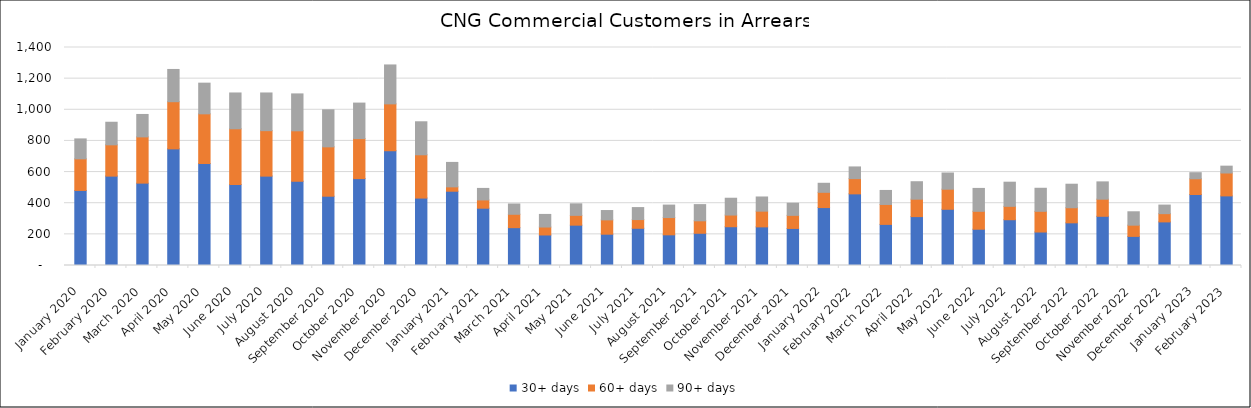
| Category | 30+ days | 60+ days | 90+ days |
|---|---|---|---|
| 2020-01-01 | 482 | 203 | 128 |
| 2020-02-01 | 574 | 201 | 145 |
| 2020-03-01 | 529 | 297 | 144 |
| 2020-04-01 | 749 | 303 | 207 |
| 2020-05-01 | 655 | 319 | 197 |
| 2020-06-01 | 520 | 358 | 230 |
| 2020-07-01 | 574 | 292 | 242 |
| 2020-08-01 | 541 | 324 | 237 |
| 2020-09-01 | 445 | 317 | 238 |
| 2020-10-01 | 558 | 257 | 228 |
| 2020-11-01 | 737 | 301 | 250 |
| 2020-12-01 | 433 | 278 | 212 |
| 2021-01-01 | 477 | 28 | 157 |
| 2021-02-01 | 368 | 53 | 74 |
| 2021-03-01 | 243 | 86 | 66 |
| 2021-04-01 | 196 | 51 | 81 |
| 2021-05-01 | 259 | 63 | 74 |
| 2021-06-01 | 201 | 92 | 60 |
| 2021-07-01 | 239 | 56 | 77 |
| 2021-08-01 | 197 | 111 | 80 |
| 2021-09-01 | 207 | 80 | 104 |
| 2021-10-01 | 249 | 75 | 108 |
| 2021-11-01 | 248 | 101 | 91 |
| 2021-12-01 | 238 | 84 | 78 |
| 2022-01-01 | 372 | 98 | 58 |
| 2022-02-01 | 460 | 98 | 75 |
| 2022-03-01 | 264 | 128 | 90 |
| 2022-04-01 | 314 | 112 | 112 |
| 2022-05-01 | 361 | 129 | 104 |
| 2022-06-01 | 233 | 115 | 147 |
| 2022-07-01 | 294 | 86 | 155 |
| 2022-08-01 | 215 | 133 | 148 |
| 2022-09-01 | 274 | 97 | 151 |
| 2022-10-01 | 316 | 110 | 111 |
| 2022-11-01 | 187 | 72 | 86 |
| 2022-12-01 | 280 | 53 | 55 |
| 2023-01-01 | 456 | 101 | 39 |
| 2023-02-01 | 447 | 147 | 44 |